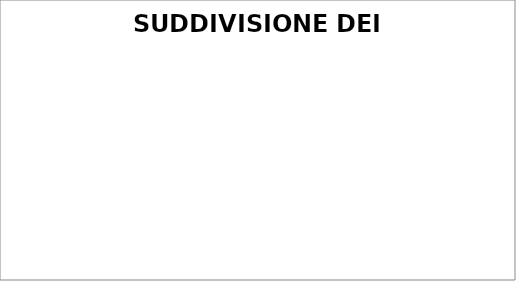
| Category | Series 0 |
|---|---|
| Costi di acquisto | 0 |
| Costi di pre-trattamento | 0 |
| Costi del personale | 0 |